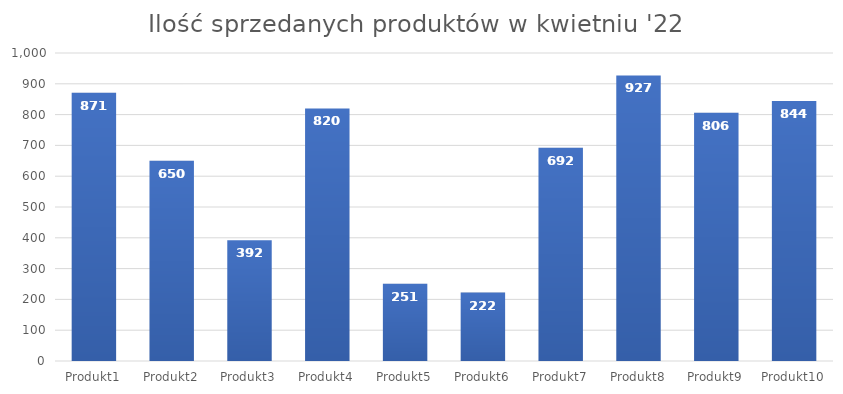
| Category | Ilość sprzedaży |
|---|---|
| Produkt1 | 871 |
| Produkt2 | 650 |
| Produkt3 | 392 |
| Produkt4 | 820 |
| Produkt5 | 251 |
| Produkt6 | 222 |
| Produkt7 | 692 |
| Produkt8 | 927 |
| Produkt9 | 806 |
| Produkt10 | 844 |